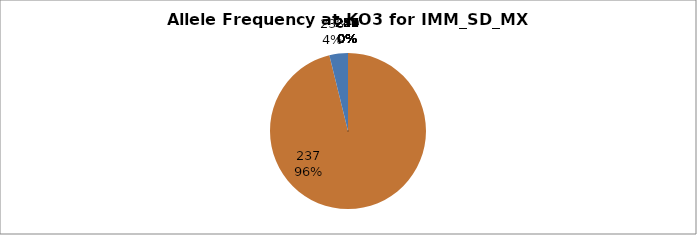
| Category | Series 0 |
|---|---|
| 218.0 | 0 |
| 224.0 | 0 |
| 227.0 | 0 |
| 235.0 | 0 |
| 236.0 | 0 |
| 237.0 | 0.962 |
| 238.0 | 0.038 |
| 239.0 | 0 |
| 240.0 | 0 |
| 241.0 | 0 |
| 247.0 | 0 |
| 249.0 | 0 |
| 250.0 | 0 |
| 251.0 | 0 |
| 252.0 | 0 |
| 254.0 | 0 |
| 255.0 | 0 |
| 256.0 | 0 |
| 257.0 | 0 |